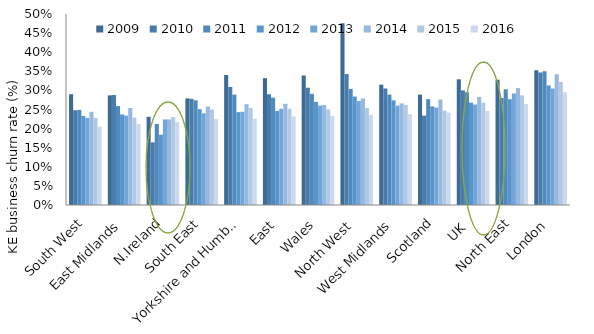
| Category | 2009 | 2010 | 2011 | 2012 | 2013 | 2014 | 2015 | 2016 |
|---|---|---|---|---|---|---|---|---|
| South West | 0.29 | 0.248 | 0.249 | 0.233 | 0.228 | 0.244 | 0.228 | 0.205 |
| East Midlands | 0.287 | 0.288 | 0.259 | 0.237 | 0.234 | 0.254 | 0.229 | 0.212 |
| N.Ireland | 0.231 | 0.164 | 0.212 | 0.184 | 0.224 | 0.224 | 0.23 | 0.217 |
| South East | 0.279 | 0.278 | 0.274 | 0.251 | 0.24 | 0.258 | 0.25 | 0.225 |
| Yorkshire and Humber | 0.34 | 0.309 | 0.289 | 0.243 | 0.244 | 0.264 | 0.254 | 0.226 |
| East | 0.332 | 0.29 | 0.281 | 0.246 | 0.252 | 0.265 | 0.252 | 0.232 |
| Wales | 0.339 | 0.307 | 0.291 | 0.27 | 0.26 | 0.262 | 0.25 | 0.233 |
| North West | 0.476 | 0.343 | 0.304 | 0.284 | 0.272 | 0.279 | 0.254 | 0.236 |
| West Midlands | 0.315 | 0.305 | 0.289 | 0.274 | 0.26 | 0.266 | 0.262 | 0.238 |
| Scotland | 0.289 | 0.234 | 0.277 | 0.258 | 0.255 | 0.276 | 0.247 | 0.242 |
| UK  | 0.329 | 0.3 | 0.295 | 0.268 | 0.263 | 0.283 | 0.268 | 0.246 |
| North East | 0.328 | 0.28 | 0.303 | 0.277 | 0.292 | 0.306 | 0.287 | 0.264 |
| London | 0.353 | 0.347 | 0.35 | 0.313 | 0.305 | 0.342 | 0.322 | 0.295 |